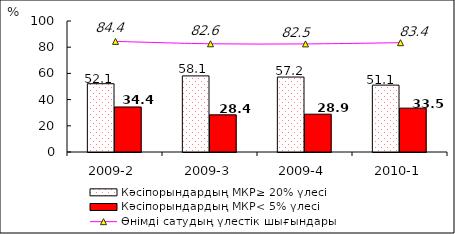
| Category | Кәсіпорындардың МКР≥ 20% үлесі | Кәсіпорындардың МКР< 5% үлесі |
|---|---|---|
| 2009-2 | 52.126 | 34.367 |
| 2009-3 | 58.093 | 28.387 |
| 2009-4 | 57.213 | 28.853 |
| 2010-1 | 51.061 | 33.475 |